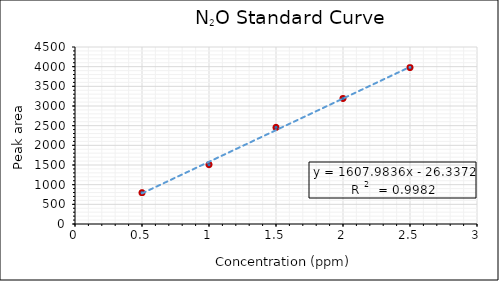
| Category | Series 0 |
|---|---|
| 0.5 | 797.558 |
| 1.0 | 1507.016 |
| 1.5 | 2457.474 |
| 2.0 | 3190.234 |
| 2.5 | 3975.908 |